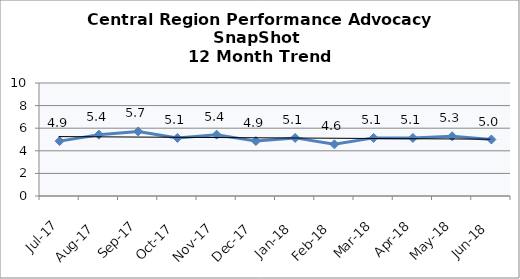
| Category | Central Region |
|---|---|
| Jul-17 | 4.857 |
| Aug-17 | 5.429 |
| Sep-17 | 5.714 |
| Oct-17 | 5.143 |
| Nov-17 | 5.429 |
| Dec-17 | 4.857 |
| Jan-18 | 5.143 |
| Feb-18 | 4.571 |
| Mar-18 | 5.143 |
| Apr-18 | 5.143 |
| May-18 | 5.286 |
| Jun-18 | 5 |